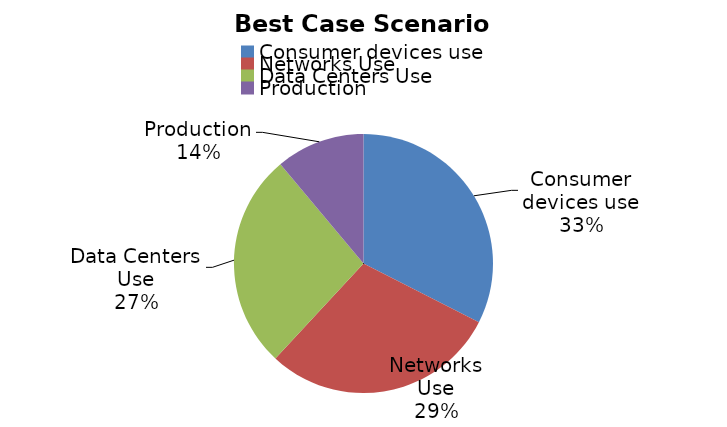
| Category | Series 0 |
|---|---|
| Consumer devices use | 440.99 |
| Networks Use | 399.261 |
| Data Centers Use | 366.439 |
| Production | 150.528 |